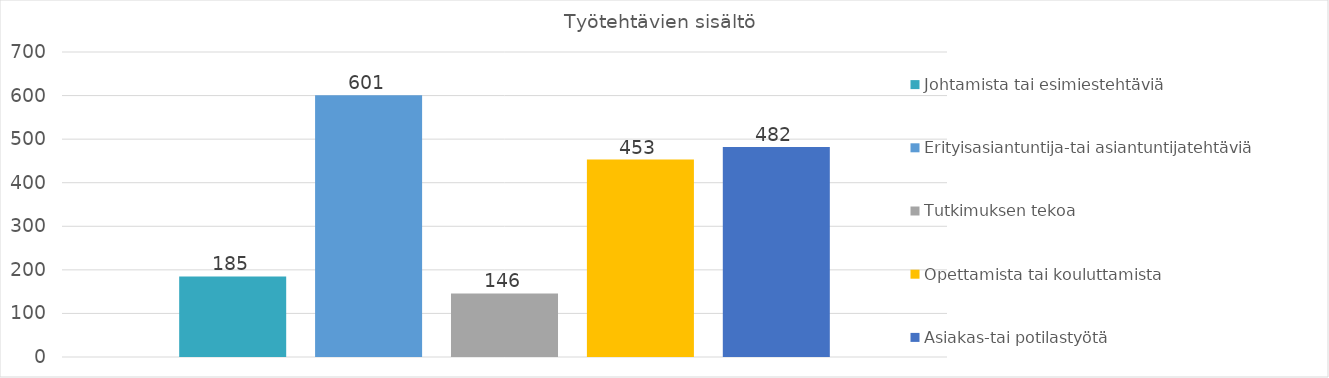
| Category | Johtamista tai esimiestehtäviä  | Erityisasiantuntija-tai asiantuntijatehtäviä  | Tutkimuksen tekoa  | Opettamista tai kouluttamista  | Asiakas-tai potilastyötä  |
|---|---|---|---|---|---|
| Summa | 185 | 601 | 146 | 453 | 482 |